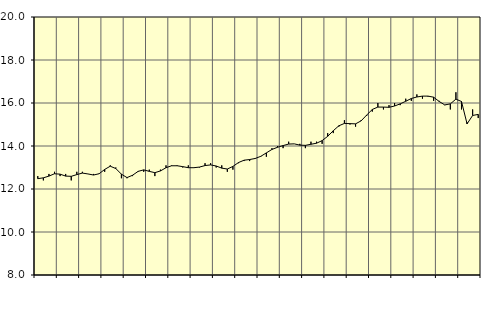
| Category | Piggar | Utbildning, SNI 85 |
|---|---|---|
| nan | 12.6 | 12.48 |
| 1.0 | 12.4 | 12.52 |
| 1.0 | 12.7 | 12.6 |
| 1.0 | 12.8 | 12.71 |
| nan | 12.6 | 12.69 |
| 2.0 | 12.7 | 12.6 |
| 2.0 | 12.4 | 12.59 |
| 2.0 | 12.8 | 12.67 |
| nan | 12.8 | 12.74 |
| 3.0 | 12.7 | 12.7 |
| 3.0 | 12.7 | 12.65 |
| 3.0 | 12.7 | 12.71 |
| nan | 12.8 | 12.91 |
| 4.0 | 13.1 | 13.06 |
| 4.0 | 13 | 12.95 |
| 4.0 | 12.5 | 12.69 |
| nan | 12.5 | 12.53 |
| 5.0 | 12.6 | 12.64 |
| 5.0 | 12.8 | 12.82 |
| 5.0 | 12.8 | 12.89 |
| nan | 12.9 | 12.82 |
| 6.0 | 12.6 | 12.76 |
| 6.0 | 12.9 | 12.84 |
| 6.0 | 13.1 | 12.99 |
| nan | 13.1 | 13.08 |
| 7.0 | 13.1 | 13.08 |
| 7.0 | 13 | 13.04 |
| 7.0 | 13.1 | 12.99 |
| nan | 13 | 12.99 |
| 8.0 | 13 | 13.02 |
| 8.0 | 13.2 | 13.09 |
| 8.0 | 13.2 | 13.12 |
| nan | 13 | 13.07 |
| 9.0 | 13.1 | 12.97 |
| 9.0 | 12.8 | 12.93 |
| 9.0 | 12.9 | 13.05 |
| nan | 13.2 | 13.23 |
| 10.0 | 13.3 | 13.34 |
| 10.0 | 13.3 | 13.37 |
| 10.0 | 13.4 | 13.42 |
| nan | 13.5 | 13.52 |
| 11.0 | 13.5 | 13.68 |
| 11.0 | 13.9 | 13.84 |
| 11.0 | 14 | 13.94 |
| nan | 13.9 | 14.02 |
| 12.0 | 14.2 | 14.09 |
| 12.0 | 14.1 | 14.1 |
| 12.0 | 14.1 | 14.04 |
| nan | 13.9 | 14.03 |
| 13.0 | 14.2 | 14.08 |
| 13.0 | 14.2 | 14.13 |
| 13.0 | 14.1 | 14.25 |
| nan | 14.6 | 14.45 |
| 14.0 | 14.6 | 14.71 |
| 14.0 | 14.9 | 14.94 |
| 14.0 | 15.2 | 15.05 |
| nan | 15 | 15.04 |
| 15.0 | 14.9 | 15.03 |
| 15.0 | 15.2 | 15.17 |
| 15.0 | 15.4 | 15.44 |
| nan | 15.6 | 15.7 |
| 16.0 | 16 | 15.81 |
| 16.0 | 15.7 | 15.81 |
| 16.0 | 15.9 | 15.8 |
| nan | 16 | 15.86 |
| 17.0 | 15.9 | 15.96 |
| 17.0 | 16.2 | 16.08 |
| 17.0 | 16.1 | 16.21 |
| nan | 16.4 | 16.28 |
| 18.0 | 16.2 | 16.32 |
| 18.0 | 16.3 | 16.32 |
| 18.0 | 16.1 | 16.27 |
| nan | 16.1 | 16.07 |
| 19.0 | 15.9 | 15.91 |
| 19.0 | 15.7 | 15.96 |
| 19.0 | 16.5 | 16.18 |
| nan | 15.7 | 16.07 |
| 20.0 | 15.1 | 15.03 |
| 20.0 | 15.7 | 15.42 |
| 20.0 | 15.3 | 15.47 |